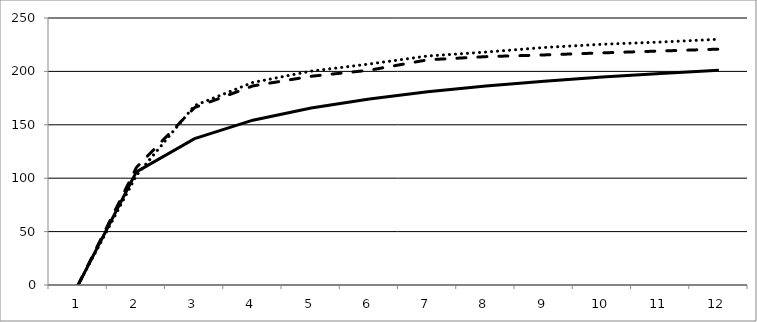
| Category | Sobs | Chao1 mean | Jacknife |
|---|---|---|---|
| 0 | 0 | 0 | 0 |
| 1 | 105.9 | 110 | 102.48 |
| 2 | 137.05 | 166.15 | 168.01 |
| 3 | 154.33 | 186.4 | 189.68 |
| 4 | 165.76 | 195.45 | 200.26 |
| 5 | 174.2 | 201.11 | 206.93 |
| 6 | 180.85 | 210.85 | 214.44 |
| 7 | 186.29 | 213.82 | 218.1 |
| 8 | 190.86 | 215.42 | 222.38 |
| 9 | 194.74 | 217.36 | 225.41 |
| 10 | 198.09 | 219.09 | 227.48 |
| 11 | 201 | 220.84 | 230.09 |